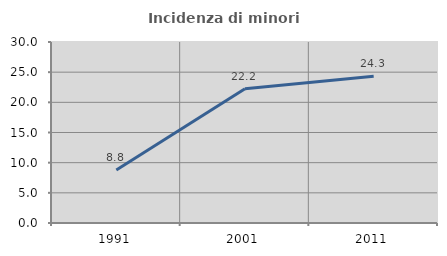
| Category | Incidenza di minori stranieri |
|---|---|
| 1991.0 | 8.791 |
| 2001.0 | 22.247 |
| 2011.0 | 24.31 |